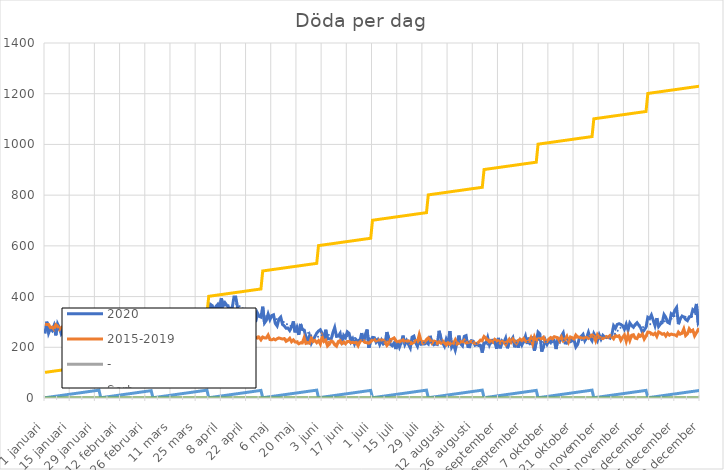
| Category | 2020 | 2015-2019 | - | Sort | Dag | Månad |
|---|---|---|---|---|---|---|
| 1 januari | 254 | 290.8 |  | 101 | 1 | 0 |
| 2 januari | 301 | 289.8 |  | 102 | 2 | 0 |
| 3 januari | 256 | 290 |  | 103 | 3 | 0 |
| 4 januari | 274 | 277.6 |  | 104 | 4 | 0 |
| 5 januari | 266 | 279.6 |  | 105 | 5 | 0 |
| 6 januari | 285 | 271 |  | 106 | 6 | 0 |
| 7 januari | 247 | 288.8 |  | 107 | 7 | 0 |
| 8 januari | 292 | 283.2 |  | 108 | 8 | 0 |
| 9 januari | 277 | 269.8 |  | 109 | 9 | 0 |
| 10 januari | 253 | 277.2 |  | 110 | 10 | 0 |
| 11 januari | 263 | 282.6 |  | 111 | 11 | 0 |
| 12 januari | 274 | 283.6 |  | 112 | 12 | 0 |
| 13 januari | 241 | 275 |  | 113 | 13 | 0 |
| 14 januari | 267 | 270.6 |  | 114 | 14 | 0 |
| 15 januari | 254 | 290.6 |  | 115 | 15 | 0 |
| 16 januari | 254 | 284.4 |  | 116 | 16 | 0 |
| 17 januari | 244 | 277.6 |  | 117 | 17 | 0 |
| 18 januari | 303 | 272.6 |  | 118 | 18 | 0 |
| 19 januari | 265 | 275.8 |  | 119 | 19 | 0 |
| 20 januari | 231 | 280.2 |  | 120 | 20 | 0 |
| 21 januari | 241 | 273 |  | 121 | 21 | 0 |
| 22 januari | 266 | 277.8 |  | 122 | 22 | 0 |
| 23 januari | 236 | 270.4 |  | 123 | 23 | 0 |
| 24 januari | 251 | 273 |  | 124 | 24 | 0 |
| 25 januari | 253 | 289.8 |  | 125 | 25 | 0 |
| 26 januari | 253 | 268.6 |  | 126 | 26 | 0 |
| 27 januari | 260 | 268.4 |  | 127 | 27 | 0 |
| 28 januari | 276 | 264.6 |  | 128 | 28 | 0 |
| 29 januari | 274 | 279.4 |  | 129 | 29 | 0 |
| 30 januari | 269 | 267.2 |  | 130 | 30 | 0 |
| 31 januari | 247 | 264.6 |  | 131 | 31 | 0 |
| 1 februari | 276 | 275.6 |  | 201 | 1 | 0 |
| 2 februari | 245 | 267.6 |  | 202 | 2 | 0 |
| 3 februari | 241 | 281 |  | 203 | 3 | 0 |
| 4 februari | 242 | 271.6 |  | 204 | 4 | 0 |
| 5 februari | 242 | 266.2 |  | 205 | 5 | 0 |
| 6 februari | 258 | 264 |  | 206 | 6 | 0 |
| 7 februari | 242 | 276.2 |  | 207 | 7 | 0 |
| 8 februari | 245 | 269.6 |  | 208 | 8 | 0 |
| 9 februari | 258 | 273.6 |  | 209 | 9 | 0 |
| 10 februari | 273 | 277.2 |  | 210 | 10 | 0 |
| 11 februari | 256 | 272 |  | 211 | 11 | 0 |
| 12 februari | 273 | 282.2 |  | 212 | 12 | 0 |
| 13 februari | 246 | 277 |  | 213 | 13 | 0 |
| 14 februari | 266 | 268.2 |  | 214 | 14 | 0 |
| 15 februari | 258 | 267.8 |  | 215 | 15 | 0 |
| 16 februari | 253 | 278.8 |  | 216 | 16 | 0 |
| 17 februari | 269 | 277.4 |  | 217 | 17 | 0 |
| 18 februari | 259 | 271.6 |  | 218 | 18 | 0 |
| 19 februari | 264 | 289 |  | 219 | 19 | 0 |
| 20 februari | 256 | 292 |  | 220 | 20 | 0 |
| 21 februari | 227 | 291.2 |  | 221 | 21 | 0 |
| 22 februari | 260 | 284.2 |  | 222 | 22 | 0 |
| 23 februari | 242 | 288.6 |  | 223 | 23 | 0 |
| 24 februari | 264 | 278.8 |  | 224 | 24 | 0 |
| 25 februari | 262 | 288.2 |  | 225 | 25 | 0 |
| 26 februari | 258 | 286.2 |  | 226 | 26 | 0 |
| 27 februari | 255 | 271 |  | 227 | 27 | 0 |
| 28 februari | 232 | 276.4 |  | 228 | 28 | 0 |
| 29 februari | 244 | 243 |  | 229 | 29 | 0 |
| 1 mars | 263 | 284.2 |  | 301 | 1 | 0 |
| 2 mars | 238 | 276.6 |  | 302 | 2 | 0 |
| 3 mars | 261 | 291.2 |  | 303 | 3 | 0 |
| 4 mars | 289 | 288.6 |  | 304 | 4 | 0 |
| 5 mars | 281 | 278.4 |  | 305 | 5 | 0 |
| 6 mars | 251 | 289.4 |  | 306 | 6 | 0 |
| 7 mars | 266 | 273.2 |  | 307 | 7 | 0 |
| 8 mars | 240 | 265.2 |  | 308 | 8 | 0 |
| 9 mars | 248 | 276.2 |  | 309 | 9 | 0 |
| 10 mars | 257 | 270.8 |  | 310 | 10 | 0 |
| 11 mars | 234 | 262.6 |  | 311 | 11 | 0 |
| 12 mars | 258 | 268 |  | 312 | 12 | 0 |
| 13 mars | 243 | 271.4 |  | 313 | 13 | 0 |
| 14 mars | 246 | 264.8 |  | 314 | 14 | 0 |
| 15 mars | 244 | 273.2 |  | 315 | 15 | 0 |
| 16 mars | 293 | 268.2 |  | 316 | 16 | 0 |
| 17 mars | 266 | 272.8 |  | 317 | 17 | 0 |
| 18 mars | 257 | 257.6 |  | 318 | 18 | 0 |
| 19 mars | 235 | 259.6 |  | 319 | 19 | 0 |
| 20 mars | 279 | 266.6 |  | 320 | 20 | 0 |
| 21 mars | 264 | 258.8 |  | 321 | 21 | 0 |
| 22 mars | 271 | 259.4 |  | 322 | 22 | 0 |
| 23 mars | 298 | 256.4 |  | 323 | 23 | 0 |
| 24 mars | 281 | 254.2 |  | 324 | 24 | 0 |
| 25 mars | 294 | 238.4 |  | 325 | 25 | 0 |
| 26 mars | 304 | 265 |  | 326 | 26 | 0 |
| 27 mars | 294 | 263.6 |  | 327 | 27 | 0 |
| 28 mars | 268 | 259.4 |  | 328 | 28 | 0 |
| 29 mars | 301 | 258.2 |  | 329 | 29 | 0 |
| 30 mars | 338 | 265.8 |  | 330 | 30 | 0 |
| 31 mars | 309 | 259 |  | 331 | 31 | 0 |
| 1 april | 328 | 259.2 |  | 401 | 1 | 0 |
| 2 april | 369 | 266.2 |  | 402 | 2 | 0 |
| 3 april | 364 | 260.6 |  | 403 | 3 | 0 |
| 4 april | 314 | 262.6 |  | 404 | 4 | 0 |
| 5 april | 361 | 251 |  | 405 | 5 | 0 |
| 6 april | 369 | 252.8 |  | 406 | 6 | 0 |
| 7 april | 344 | 270.2 |  | 407 | 7 | 0 |
| 8 april | 393 | 246.6 |  | 408 | 8 | 0 |
| 9 april | 364 | 242.4 |  | 409 | 9 | 0 |
| 10 april | 376 | 247.4 |  | 410 | 10 | 0 |
| 11 april | 366 | 237 |  | 411 | 11 | 0 |
| 12 april | 357 | 253.2 |  | 412 | 12 | 0 |
| 13 april | 354 | 257.4 |  | 413 | 13 | 0 |
| 14 april | 353 | 252.8 |  | 414 | 14 | 0 |
| 15 april | 398 | 242.8 |  | 415 | 15 | 0 |
| 16 april | 398 | 253.8 |  | 416 | 16 | 0 |
| 17 april | 358 | 261.8 |  | 417 | 17 | 0 |
| 18 april | 338 | 242.8 |  | 418 | 18 | 0 |
| 19 april | 326 | 240.8 |  | 419 | 19 | 0 |
| 20 april | 310 | 252 |  | 420 | 20 | 0 |
| 21 april | 332 | 253.2 |  | 421 | 21 | 0 |
| 22 april | 332 | 251 |  | 422 | 22 | 0 |
| 23 april | 326 | 246 |  | 423 | 23 | 0 |
| 24 april | 312 | 251 |  | 424 | 24 | 0 |
| 25 april | 331 | 248.6 |  | 425 | 25 | 0 |
| 26 april | 325 | 245.6 |  | 426 | 26 | 0 |
| 27 april | 300 | 239.6 |  | 427 | 27 | 0 |
| 28 april | 336 | 236.2 |  | 428 | 28 | 0 |
| 29 april | 322 | 239.4 |  | 429 | 29 | 0 |
| 30 april | 319 | 229.4 |  | 430 | 30 | 0 |
| 1 maj | 360 | 240.4 |  | 501 | 1 | 0 |
| 2 maj | 296 | 237 |  | 502 | 2 | 0 |
| 3 maj | 306 | 237 |  | 503 | 3 | 0 |
| 4 maj | 331 | 248.4 |  | 504 | 4 | 0 |
| 5 maj | 309 | 230.4 |  | 505 | 5 | 0 |
| 6 maj | 325 | 229.4 |  | 506 | 6 | 0 |
| 7 maj | 328 | 232.4 |  | 507 | 7 | 0 |
| 8 maj | 294 | 229.2 |  | 508 | 8 | 0 |
| 9 maj | 284 | 233.8 |  | 509 | 9 | 0 |
| 10 maj | 311 | 237 |  | 510 | 10 | 0 |
| 11 maj | 319 | 234.4 |  | 511 | 11 | 0 |
| 12 maj | 290 | 232.6 |  | 512 | 12 | 0 |
| 13 maj | 284 | 234.2 |  | 513 | 13 | 0 |
| 14 maj | 275 | 223.6 |  | 514 | 14 | 0 |
| 15 maj | 276 | 227.8 |  | 515 | 15 | 0 |
| 16 maj | 266 | 235.4 |  | 516 | 16 | 0 |
| 17 maj | 279 | 222.2 |  | 517 | 17 | 0 |
| 18 maj | 302 | 229.2 |  | 518 | 18 | 0 |
| 19 maj | 259 | 220.6 |  | 519 | 19 | 0 |
| 20 maj | 278 | 220.4 |  | 520 | 20 | 0 |
| 21 maj | 249 | 213.6 |  | 521 | 21 | 0 |
| 22 maj | 292 | 217.6 |  | 522 | 22 | 0 |
| 23 maj | 270 | 217 |  | 523 | 23 | 0 |
| 24 maj | 268 | 237.8 |  | 524 | 24 | 0 |
| 25 maj | 242 | 215.6 |  | 525 | 25 | 0 |
| 26 maj | 225 | 218.8 |  | 526 | 26 | 0 |
| 27 maj | 245 | 215.8 |  | 527 | 27 | 0 |
| 28 maj | 216 | 237.4 |  | 528 | 28 | 0 |
| 29 maj | 230 | 222.4 |  | 529 | 29 | 0 |
| 30 maj | 242 | 227.2 |  | 530 | 30 | 0 |
| 31 maj | 256 | 218.2 |  | 531 | 31 | 0 |
| 1 juni | 264 | 226 |  | 601 | 1 | 0 |
| 2 juni | 269 | 212.6 |  | 602 | 2 | 0 |
| 3 juni | 255 | 241.8 |  | 603 | 3 | 0 |
| 4 juni | 227 | 222.8 |  | 604 | 4 | 0 |
| 5 juni | 269 | 228 |  | 605 | 5 | 0 |
| 6 juni | 233 | 205 |  | 606 | 6 | 0 |
| 7 juni | 234 | 211.6 |  | 607 | 7 | 0 |
| 8 juni | 231 | 224.4 |  | 608 | 8 | 0 |
| 9 juni | 258 | 221.8 |  | 609 | 9 | 0 |
| 10 juni | 278 | 209.6 |  | 610 | 10 | 0 |
| 11 juni | 243 | 204.2 |  | 611 | 11 | 0 |
| 12 juni | 244 | 222.6 |  | 612 | 12 | 0 |
| 13 juni | 255 | 226.4 |  | 613 | 13 | 0 |
| 14 juni | 212 | 214.4 |  | 614 | 14 | 0 |
| 15 juni | 247 | 220.8 |  | 615 | 15 | 0 |
| 16 juni | 238 | 214 |  | 616 | 16 | 0 |
| 17 juni | 261 | 222.8 |  | 617 | 17 | 0 |
| 18 juni | 255 | 223.4 |  | 618 | 18 | 0 |
| 19 juni | 222 | 217.6 |  | 619 | 19 | 0 |
| 20 juni | 234 | 219.6 |  | 620 | 20 | 0 |
| 21 juni | 213 | 218 |  | 621 | 21 | 0 |
| 22 juni | 229 | 219.2 |  | 622 | 22 | 0 |
| 23 juni | 221 | 206 |  | 623 | 23 | 0 |
| 24 juni | 226 | 222.4 |  | 624 | 24 | 0 |
| 25 juni | 256 | 226.6 |  | 625 | 25 | 0 |
| 26 juni | 222 | 226.4 |  | 626 | 26 | 0 |
| 27 juni | 250 | 218.8 |  | 627 | 27 | 0 |
| 28 juni | 270 | 217.8 |  | 628 | 28 | 0 |
| 29 juni | 198 | 216 |  | 629 | 29 | 0 |
| 30 juni | 228 | 222.4 |  | 630 | 30 | 0 |
| 1 juli | 239 | 229.4 |  | 701 | 1 | 0 |
| 2 juli | 238 | 230.4 |  | 702 | 2 | 0 |
| 3 juli | 220 | 225.8 |  | 703 | 3 | 0 |
| 4 juli | 230 | 229 |  | 704 | 4 | 0 |
| 5 juli | 211 | 228.4 |  | 705 | 5 | 0 |
| 6 juli | 228 | 229.2 |  | 706 | 6 | 0 |
| 7 juli | 213 | 228.2 |  | 707 | 7 | 0 |
| 8 juli | 218 | 219.8 |  | 708 | 8 | 0 |
| 9 juli | 260 | 207 |  | 709 | 9 | 0 |
| 10 juli | 235 | 215.4 |  | 710 | 10 | 0 |
| 11 juli | 211 | 231 |  | 711 | 11 | 0 |
| 12 juli | 206 | 232.6 |  | 712 | 12 | 0 |
| 13 juli | 217 | 237 |  | 713 | 13 | 0 |
| 14 juli | 193 | 226.4 |  | 714 | 14 | 0 |
| 15 juli | 225 | 220 |  | 715 | 15 | 0 |
| 16 juli | 201 | 221 |  | 716 | 16 | 0 |
| 17 juli | 220 | 225.4 |  | 717 | 17 | 0 |
| 18 juli | 246 | 229.4 |  | 718 | 18 | 0 |
| 19 juli | 211 | 220.8 |  | 719 | 19 | 0 |
| 20 juli | 226 | 224.6 |  | 720 | 20 | 0 |
| 21 juli | 211 | 225.4 |  | 721 | 21 | 0 |
| 22 juli | 197 | 214.2 |  | 722 | 22 | 0 |
| 23 juli | 240 | 215 |  | 723 | 23 | 0 |
| 24 juli | 244 | 220 |  | 724 | 24 | 0 |
| 25 juli | 218 | 226 |  | 725 | 25 | 0 |
| 26 juli | 204 | 222.4 |  | 726 | 26 | 0 |
| 27 juli | 231 | 250.2 |  | 727 | 27 | 0 |
| 28 juli | 212 | 225 |  | 728 | 28 | 0 |
| 29 juli | 213 | 215.8 |  | 729 | 29 | 0 |
| 30 juli | 213 | 220.2 |  | 730 | 30 | 0 |
| 31 juli | 219 | 231 |  | 731 | 31 | 0 |
| 1 augusti | 213 | 237.2 |  | 801 | 1 | 0 |
| 2 augusti | 245 | 229.8 |  | 802 | 2 | 0 |
| 3 augusti | 218 | 216 |  | 803 | 3 | 0 |
| 4 augusti | 210 | 224.2 |  | 804 | 4 | 0 |
| 5 augusti | 213 | 222.6 |  | 805 | 5 | 0 |
| 6 augusti | 211 | 215.2 |  | 806 | 6 | 0 |
| 7 augusti | 265 | 221.6 |  | 807 | 7 | 0 |
| 8 augusti | 237 | 216.2 |  | 808 | 8 | 0 |
| 9 augusti | 217 | 225.2 |  | 809 | 9 | 0 |
| 10 augusti | 204 | 217.6 |  | 810 | 10 | 0 |
| 11 augusti | 232 | 209.4 |  | 811 | 11 | 0 |
| 12 augusti | 216 | 217.6 |  | 812 | 12 | 0 |
| 13 augusti | 264 | 211.6 |  | 813 | 13 | 0 |
| 14 augusti | 200 | 220.2 |  | 814 | 14 | 0 |
| 15 augusti | 212 | 215.8 |  | 815 | 15 | 0 |
| 16 augusti | 189 | 229.4 |  | 816 | 16 | 0 |
| 17 augusti | 220 | 212.6 |  | 817 | 17 | 0 |
| 18 augusti | 246 | 216 |  | 818 | 18 | 0 |
| 19 augusti | 214 | 222 |  | 819 | 19 | 0 |
| 20 augusti | 206 | 219.4 |  | 820 | 20 | 0 |
| 21 augusti | 243 | 227.4 |  | 821 | 21 | 0 |
| 22 augusti | 246 | 217 |  | 822 | 22 | 0 |
| 23 augusti | 203 | 219.2 |  | 823 | 23 | 0 |
| 24 augusti | 202 | 221.2 |  | 824 | 24 | 0 |
| 25 augusti | 226 | 223.4 |  | 825 | 25 | 0 |
| 26 augusti | 224 | 218 |  | 826 | 26 | 0 |
| 27 augusti | 208 | 215.2 |  | 827 | 27 | 0 |
| 28 augusti | 211 | 215.4 |  | 828 | 28 | 0 |
| 29 augusti | 207 | 219.8 |  | 829 | 29 | 0 |
| 30 augusti | 207 | 228.6 |  | 830 | 30 | 0 |
| 31 augusti | 179 | 227.4 |  | 831 | 31 | 0 |
| 1 september | 217 | 242.6 |  | 901 | 1 | 0 |
| 2 september | 217 | 236.6 |  | 902 | 2 | 0 |
| 3 september | 239 | 229 |  | 903 | 3 | 0 |
| 4 september | 210 | 221.2 |  | 904 | 4 | 0 |
| 5 september | 227 | 224.6 |  | 905 | 5 | 0 |
| 6 september | 228 | 219.4 |  | 906 | 6 | 0 |
| 7 september | 220 | 231 |  | 907 | 7 | 0 |
| 8 september | 194 | 225.2 |  | 908 | 8 | 0 |
| 9 september | 237 | 225.6 |  | 909 | 9 | 0 |
| 10 september | 196 | 216.4 |  | 910 | 10 | 0 |
| 11 september | 225 | 223.4 |  | 911 | 11 | 0 |
| 12 september | 219 | 219.2 |  | 912 | 12 | 0 |
| 13 september | 236 | 210.8 |  | 913 | 13 | 0 |
| 14 september | 196 | 222.6 |  | 914 | 14 | 0 |
| 15 september | 223 | 232 |  | 915 | 15 | 0 |
| 16 september | 227 | 219.6 |  | 916 | 16 | 0 |
| 17 september | 238 | 232.2 |  | 917 | 17 | 0 |
| 18 september | 200 | 222.8 |  | 918 | 18 | 0 |
| 19 september | 229 | 215.4 |  | 919 | 19 | 0 |
| 20 september | 199 | 226.4 |  | 920 | 20 | 0 |
| 21 september | 225 | 232 |  | 921 | 21 | 0 |
| 22 september | 209 | 226.4 |  | 922 | 22 | 0 |
| 23 september | 225 | 234.2 |  | 923 | 23 | 0 |
| 24 september | 244 | 223 |  | 924 | 24 | 0 |
| 25 september | 213 | 222.4 |  | 925 | 25 | 0 |
| 26 september | 238 | 223.4 |  | 926 | 26 | 0 |
| 27 september | 209 | 238 |  | 927 | 27 | 0 |
| 28 september | 242 | 214 |  | 928 | 28 | 0 |
| 29 september | 187 | 241.6 |  | 929 | 29 | 0 |
| 30 september | 220 | 225.6 |  | 930 | 30 | 0 |
| 1 oktober | 260 | 233.2 |  | 1001 | 1 | 0 |
| 2 oktober | 253 | 233.6 |  | 1002 | 2 | 0 |
| 3 oktober | 183 | 233.6 |  | 1003 | 3 | 0 |
| 4 oktober | 202 | 239.6 |  | 1004 | 4 | 0 |
| 5 oktober | 229 | 222.4 |  | 1005 | 5 | 0 |
| 6 oktober | 212 | 222.8 |  | 1006 | 6 | 0 |
| 7 oktober | 227 | 232.4 |  | 1007 | 7 | 0 |
| 8 oktober | 219 | 238.4 |  | 1008 | 8 | 0 |
| 9 oktober | 234 | 233.6 |  | 1009 | 9 | 0 |
| 10 oktober | 227 | 241.8 |  | 1010 | 10 | 0 |
| 11 oktober | 193 | 239.6 |  | 1011 | 11 | 0 |
| 12 oktober | 231 | 237.2 |  | 1012 | 12 | 0 |
| 13 oktober | 223 | 224.8 |  | 1013 | 13 | 0 |
| 14 oktober | 245 | 240.2 |  | 1014 | 14 | 0 |
| 15 oktober | 257 | 224.8 |  | 1015 | 15 | 0 |
| 16 oktober | 217 | 229.6 |  | 1016 | 16 | 0 |
| 17 oktober | 216 | 242.8 |  | 1017 | 17 | 0 |
| 18 oktober | 223 | 221.6 |  | 1018 | 18 | 0 |
| 19 oktober | 222 | 240.6 |  | 1019 | 19 | 0 |
| 20 oktober | 226 | 237.8 |  | 1020 | 20 | 0 |
| 21 oktober | 229 | 233.4 |  | 1021 | 21 | 0 |
| 22 oktober | 201 | 248.4 |  | 1022 | 22 | 0 |
| 23 oktober | 211 | 240.8 |  | 1023 | 23 | 0 |
| 24 oktober | 237 | 239.8 |  | 1024 | 24 | 0 |
| 25 oktober | 243 | 236.2 |  | 1025 | 25 | 0 |
| 26 oktober | 251 | 236 |  | 1026 | 26 | 0 |
| 27 oktober | 226 | 235.2 |  | 1027 | 27 | 0 |
| 28 oktober | 238 | 239 |  | 1028 | 28 | 0 |
| 29 oktober | 259 | 235.2 |  | 1029 | 29 | 0 |
| 30 oktober | 237 | 243.6 |  | 1030 | 30 | 0 |
| 31 oktober | 226 | 248.6 |  | 1031 | 31 | 0 |
| 1 november | 254 | 243.8 |  | 1101 | 1 | 0 |
| 2 november | 241 | 225.6 |  | 1102 | 2 | 0 |
| 3 november | 226 | 249.2 |  | 1103 | 3 | 0 |
| 4 november | 249 | 238.4 |  | 1104 | 4 | 0 |
| 5 november | 232 | 236.2 |  | 1105 | 5 | 0 |
| 6 november | 247 | 234.2 |  | 1106 | 6 | 0 |
| 7 november | 240 | 238.6 |  | 1107 | 7 | 0 |
| 8 november | 238 | 242.6 |  | 1108 | 8 | 0 |
| 9 november | 240 | 239 |  | 1109 | 9 | 0 |
| 10 november | 236 | 246.4 |  | 1110 | 10 | 0 |
| 11 november | 249 | 241.8 |  | 1111 | 11 | 0 |
| 12 november | 285 | 233.6 |  | 1112 | 12 | 0 |
| 13 november | 275 | 247.6 |  | 1113 | 13 | 0 |
| 14 november | 290 | 242.8 |  | 1114 | 14 | 0 |
| 15 november | 293 | 245.2 |  | 1115 | 15 | 0 |
| 16 november | 290 | 227.4 |  | 1116 | 16 | 0 |
| 17 november | 285 | 239.6 |  | 1117 | 17 | 0 |
| 18 november | 271 | 248.6 |  | 1118 | 18 | 0 |
| 19 november | 291 | 223.4 |  | 1119 | 19 | 0 |
| 20 november | 267 | 248.6 |  | 1120 | 20 | 0 |
| 21 november | 296 | 226.8 |  | 1121 | 21 | 0 |
| 22 november | 286 | 247.4 |  | 1122 | 22 | 0 |
| 23 november | 279 | 249.6 |  | 1123 | 23 | 0 |
| 24 november | 290 | 235.8 |  | 1124 | 24 | 0 |
| 25 november | 297 | 234 |  | 1125 | 25 | 0 |
| 26 november | 287 | 249.4 |  | 1126 | 26 | 0 |
| 27 november | 277 | 244.2 |  | 1127 | 27 | 0 |
| 28 november | 259 | 252.2 |  | 1128 | 28 | 0 |
| 29 november | 268 | 232.4 |  | 1129 | 29 | 0 |
| 30 november | 279 | 244.2 |  | 1130 | 30 | 0 |
| 1 december | 318 | 260 |  | 1201 | 1 | 0 |
| 2 december | 313 | 259 |  | 1202 | 2 | 0 |
| 3 december | 327 | 254.8 |  | 1203 | 3 | 0 |
| 4 december | 307 | 249.8 |  | 1204 | 4 | 0 |
| 5 december | 285 | 255.6 |  | 1205 | 5 | 0 |
| 6 december | 315 | 242.8 |  | 1206 | 6 | 0 |
| 7 december | 282 | 260.6 |  | 1207 | 7 | 0 |
| 8 december | 292 | 256.8 |  | 1208 | 8 | 0 |
| 9 december | 297 | 251.2 |  | 1209 | 9 | 0 |
| 10 december | 329 | 254 |  | 1210 | 10 | 0 |
| 11 december | 318 | 244.4 |  | 1211 | 11 | 0 |
| 12 december | 299 | 255.2 |  | 1212 | 12 | 0 |
| 13 december | 295 | 247.6 |  | 1213 | 13 | 0 |
| 14 december | 332 | 252.2 |  | 1214 | 14 | 0 |
| 15 december | 326 | 250 |  | 1215 | 15 | 0 |
| 16 december | 346 | 249 |  | 1216 | 16 | 0 |
| 17 december | 357 | 244.8 |  | 1217 | 17 | 0 |
| 18 december | 291 | 259.8 |  | 1218 | 18 | 0 |
| 19 december | 313 | 251.8 |  | 1219 | 19 | 0 |
| 20 december | 322 | 255.6 |  | 1220 | 20 | 0 |
| 21 december | 320 | 272.8 |  | 1221 | 21 | 0 |
| 22 december | 310 | 246 |  | 1222 | 22 | 0 |
| 23 december | 305 | 252.6 |  | 1223 | 23 | 0 |
| 24 december | 320 | 273 |  | 1224 | 24 | 0 |
| 25 december | 321 | 263 |  | 1225 | 25 | 0 |
| 26 december | 348 | 267.8 |  | 1226 | 26 | 0 |
| 27 december | 341 | 245 |  | 1227 | 27 | 0 |
| 28 december | 371 | 257 |  | 1228 | 28 | 0 |
| 29 december | 296 | 269.8 |  | 1229 | 29 | 0 |
| 30 december | 308 | 264.6 |  | 1230 | 30 | 0 |